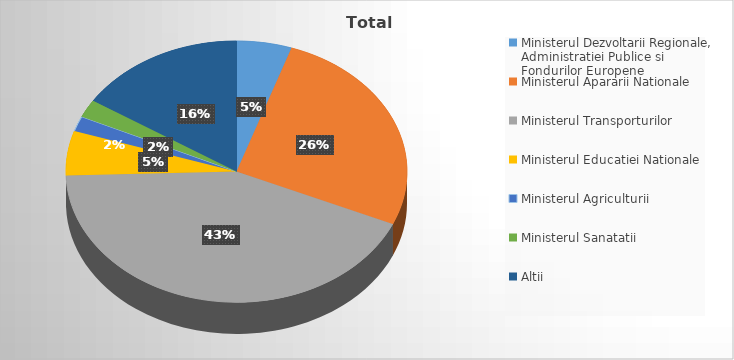
| Category | Series 0 |
|---|---|
| Ministerul Dezvoltarii Regionale, Administratiei Publice si Fondurilor Europene | 5.22 |
| Ministerul Apararii Nationale | 26.347 |
| Ministerul Transporturilor | 42.96 |
| Ministerul Educatiei Nationale | 5.494 |
| Ministerul Agriculturii | 1.882 |
| Ministerul Sanatatii | 2.212 |
| Altii | 15.886 |